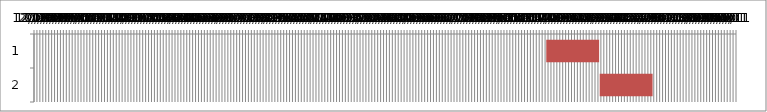
| Category | Fecha de inicio | DURACIÓN |
|---|---|---|
| 0 | 1/1/16 | 90 |
| 1 | 4/1/16 | 90 |